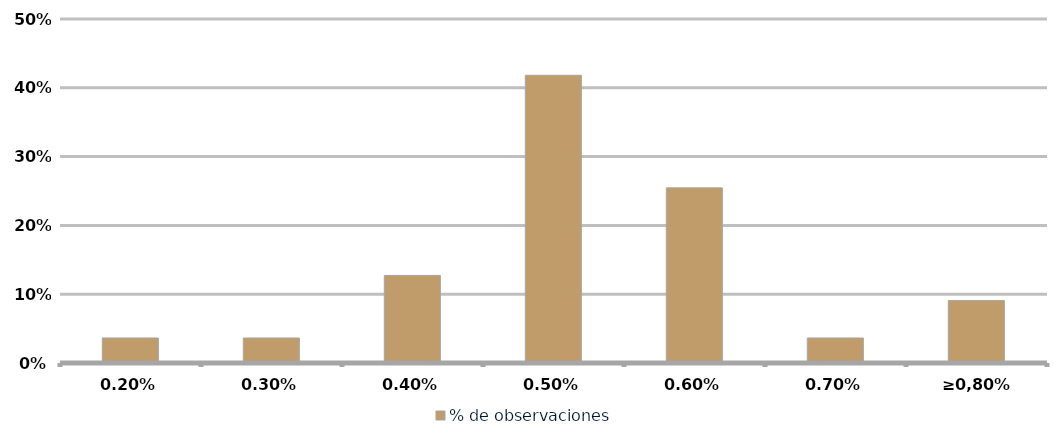
| Category | % de observaciones  |
|---|---|
| 0,20% | 0.036 |
| 0,30% | 0.036 |
| 0,40% | 0.127 |
| 0,50% | 0.418 |
| 0,60% | 0.255 |
| 0,70% | 0.036 |
| ≥0,80% | 0.091 |